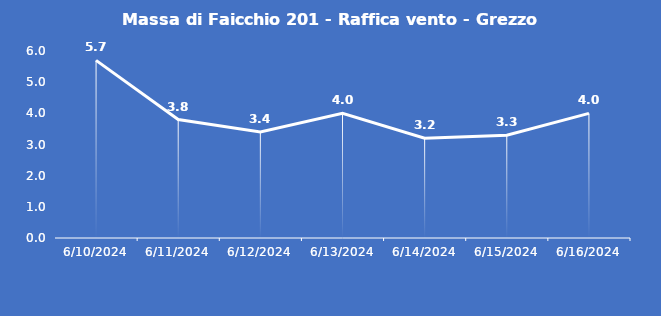
| Category | Massa di Faicchio 201 - Raffica vento - Grezzo (m/s) |
|---|---|
| 6/10/24 | 5.7 |
| 6/11/24 | 3.8 |
| 6/12/24 | 3.4 |
| 6/13/24 | 4 |
| 6/14/24 | 3.2 |
| 6/15/24 | 3.3 |
| 6/16/24 | 4 |